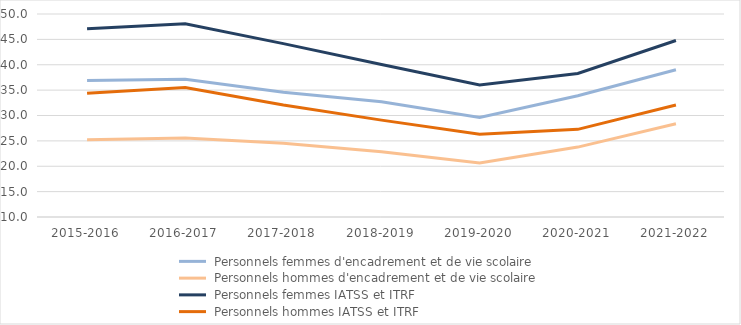
| Category |  Personnels femmes d'encadrement et de vie scolaire |  Personnels hommes d'encadrement et de vie scolaire |  Personnels femmes IATSS et ITRF |  Personnels hommes IATSS et ITRF |
|---|---|---|---|---|
| 2015-2016 | 36.891 | 25.226 | 47.111 | 34.387 |
| 2016-2017 | 37.145 | 25.587 | 48.068 | 35.518 |
| 2017-2018 | 34.604 | 24.532 | 44.162 | 32.061 |
| 2018-2019 | 32.729 | 22.856 | 40.065 | 29.09 |
| 2019-2020 | 29.605 | 20.644 | 36.013 | 26.296 |
| 2020-2021 | 33.889 | 23.776 | 38.271 | 27.275 |
| 2021-2022 | 39.02 | 28.36 | 44.77 | 32.061 |